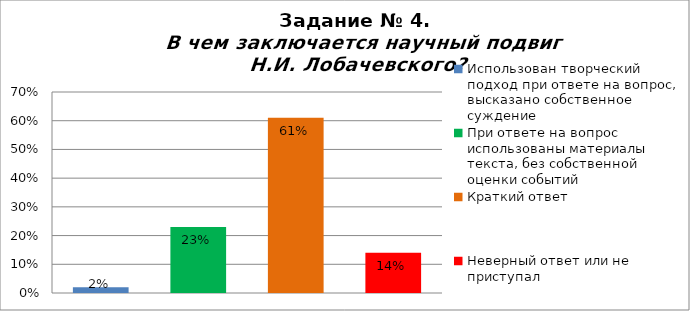
| Category | В чем заключается научный подвиг Н.И. Лобачевского? |
|---|---|
| Использован творческий подход при ответе на вопрос, высказано собственное суждение | 0.02 |
| При ответе на вопрос использованы материалы текста, без собственной оценки событий | 0.23 |
| Краткий ответ | 0.61 |
| Неверный ответ или не приступал | 0.14 |